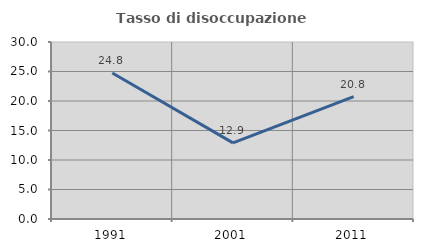
| Category | Tasso di disoccupazione giovanile  |
|---|---|
| 1991.0 | 24.757 |
| 2001.0 | 12.903 |
| 2011.0 | 20.755 |